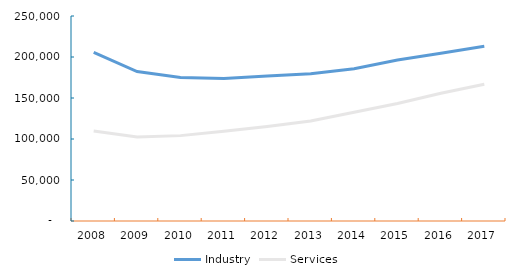
| Category | Industry | Services |
|---|---|---|
| 2008.0 | 205622 | 109848 |
| 2009.0 | 182294 | 102524 |
| 2010.0 | 174988 | 104114 |
| 2011.0 | 173781 | 109404 |
| 2012.0 | 176708 | 115263 |
| 2013.0 | 179535 | 121937 |
| 2014.0 | 185612 | 132645 |
| 2015.0 | 196393 | 143239 |
| 2016.0 | 204597 | 155844 |
| 2017.0 | 213092 | 166718 |